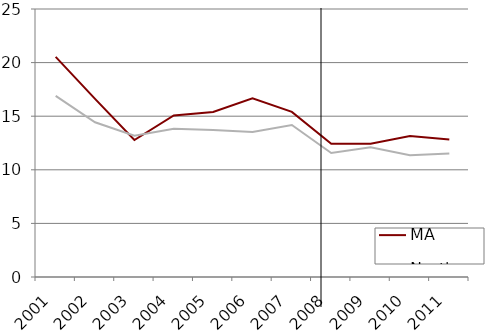
| Category | MA | Northeast |
|---|---|---|
| 2001.0 | 20.53 | 16.9 |
| 2002.0 | 16.61 | 14.43 |
| 2003.0 | 12.78 | 13.18 |
| 2004.0 | 15.07 | 13.82 |
| 2005.0 | 15.39 | 13.72 |
| 2006.0 | 16.68 | 13.52 |
| 2007.0 | 15.4 | 14.18 |
| 2008.0 | 12.42 | 11.56 |
| 2009.0 | 12.44 | 12.1 |
| 2010.0 | 13.16 | 11.35 |
| 2011.0 | 12.83 | 11.52 |